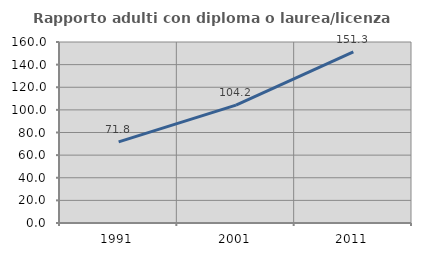
| Category | Rapporto adulti con diploma o laurea/licenza media  |
|---|---|
| 1991.0 | 71.752 |
| 2001.0 | 104.166 |
| 2011.0 | 151.286 |